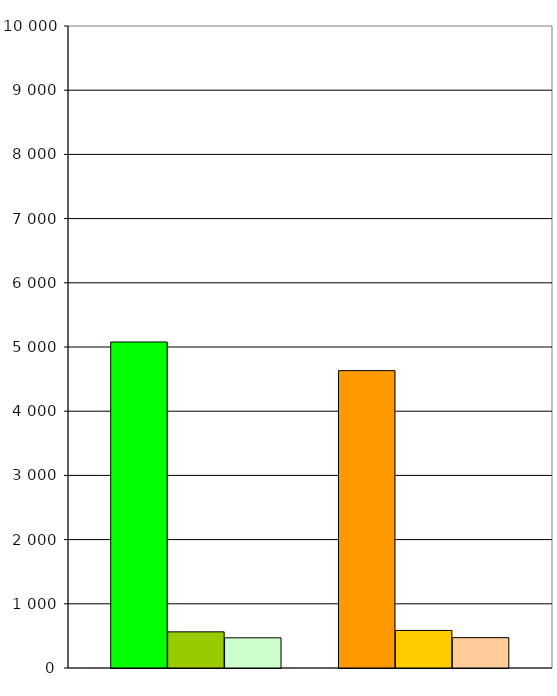
| Category | Series 0 | Series 1 | Series 2 | Series 3 | Series 4 | Series 5 | Series 6 |
|---|---|---|---|---|---|---|---|
| 0 | 5078 | 563 | 470 |  | 4632 | 585 | 473 |